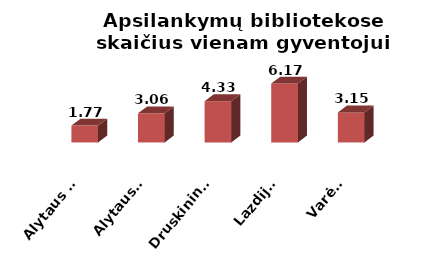
| Category | Series 0 |
|---|---|
| Alytaus m. | 1.765 |
| Alytaus r. | 3.055 |
| Druskininkai | 4.327 |
| Lazdijai | 6.174 |
| Varėna | 3.147 |